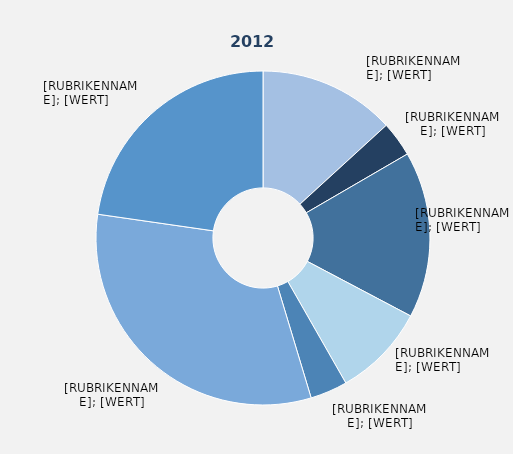
| Category | Series 1 |
|---|---|
| Produzierendes Gewerbe² ohne Baugewerbe | 13.2 |
| Baugewerbe | 3.4 |
| Handel | 16.1 |
| Verkehr und Lagerei | 9 |
| Gastgewerbe | 3.6 |
| Erbringung von Unternehmensdienstleistungen | 31.9 |
| Erbringung von öffentlichen und privaten Dienstleistungen | 22.7 |